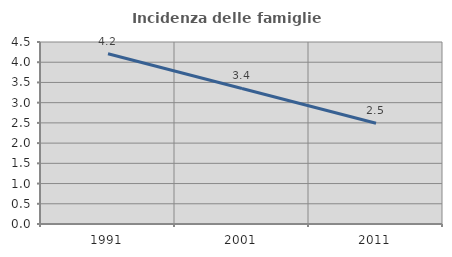
| Category | Incidenza delle famiglie numerose |
|---|---|
| 1991.0 | 4.21 |
| 2001.0 | 3.35 |
| 2011.0 | 2.49 |